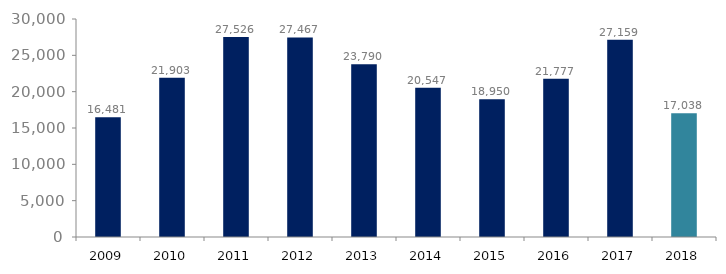
| Category | Series 1 |
|---|---|
| 2009.0 | 16481 |
| 2010.0 | 21903 |
| 2011.0 | 27526 |
| 2012.0 | 27467 |
| 2013.0 | 23790 |
| 2014.0 | 20547 |
| 2015.0 | 18950.14 |
| 2016.0 | 21776.636 |
| 2017.0 | 27158.582 |
| 2018.0 | 17038.411 |